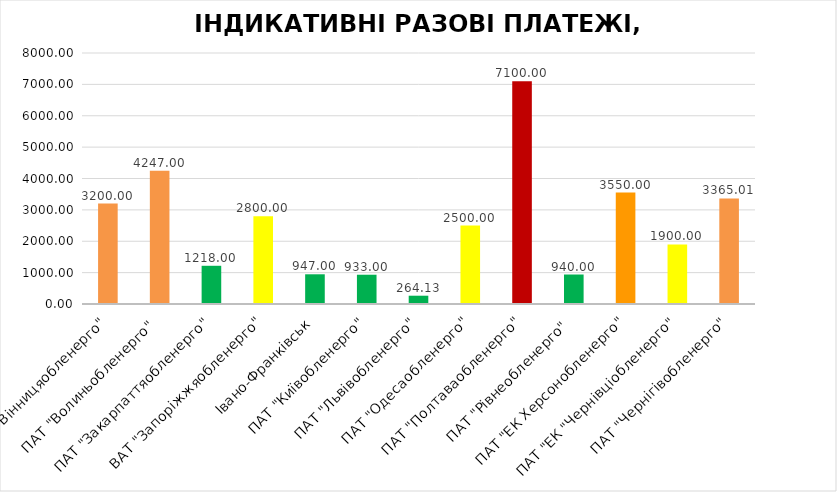
| Category | Series 0 |
|---|---|
| ПАТ "Вінницяобленерго" | 3200 |
| ПАТ "Волиньобленерго"  | 4247 |
| ПАТ "Закарпаттяобленерго" | 1218 |
| ВАТ "Запоріжжяобленерго" | 2800 |
| Івано-Франківськ | 947 |
| ПАТ "Київобленерго" | 933 |
| ПАТ "Львівобленерго" | 264.13 |
| ПАТ "Одесаобленерго" | 2500 |
| ПАТ "Полтаваобленерго" | 7100 |
| ПАТ "Рівнеобленерго"  | 940 |
| ПАТ "ЕК Херсонобленерго" | 3550 |
| ПАТ "ЕК "Чернівціобленерго" | 1900 |
| ПАТ "Чернігівобленерго" | 3365.01 |